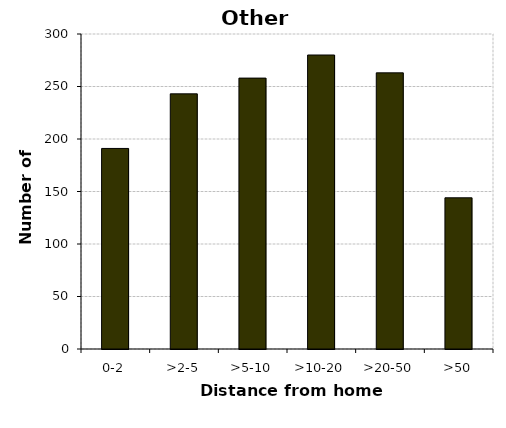
| Category | Other vehicles |
|---|---|
| 0-2 | 191 |
| >2-5 | 243 |
| >5-10 | 258 |
| >10-20 | 280 |
| >20-50 | 263 |
| >50 | 144 |